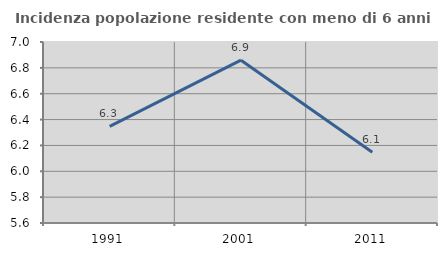
| Category | Incidenza popolazione residente con meno di 6 anni |
|---|---|
| 1991.0 | 6.347 |
| 2001.0 | 6.86 |
| 2011.0 | 6.147 |